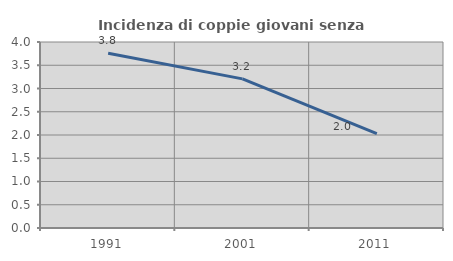
| Category | Incidenza di coppie giovani senza figli |
|---|---|
| 1991.0 | 3.759 |
| 2001.0 | 3.207 |
| 2011.0 | 2.03 |